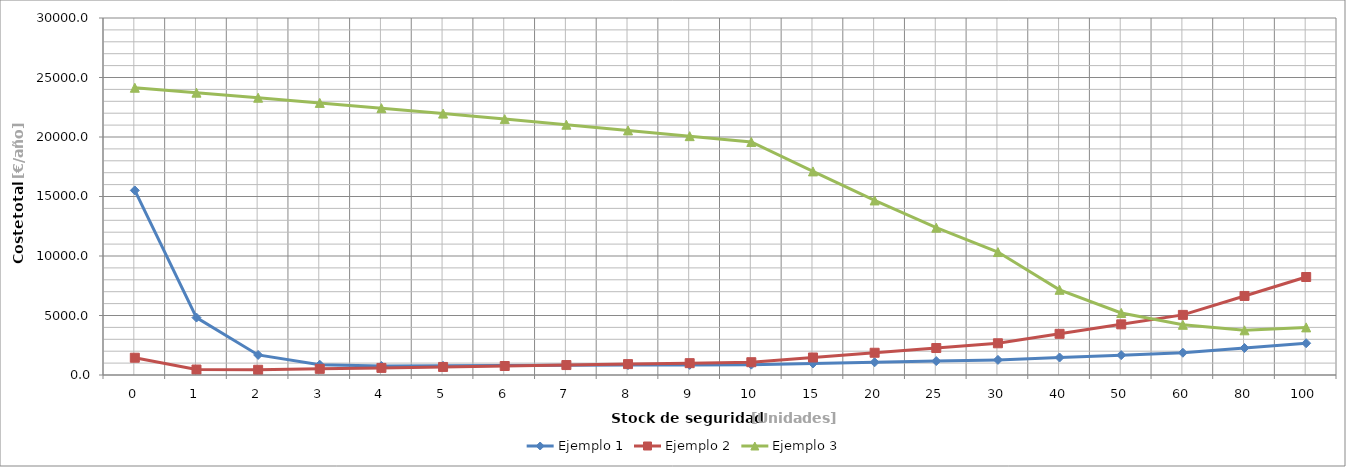
| Category | Ejemplo 1 | Ejemplo 2 | Ejemplo 3 | Item 4 | Item 5 | Item 6 | Item 7 | Item 8 | Item 9 | Item 10 | Item 11 | Item 12 | Item 13 | Item 14 | Item 15 | Item 16 | Item 17 | Item 18 | Item 19 | Item 20 | Item 21 | Item 22 | Item 23 | Item 24 | Item 25 | Item 26 | Item 27 | Item 28 | Item 29 | Item 30 |
|---|---|---|---|---|---|---|---|---|---|---|---|---|---|---|---|---|---|---|---|---|---|---|---|---|---|---|---|---|---|---|
| 0.0 | 15513.284 | 1451.674 | 24139.091 |  |  |  |  |  |  |  |  |  |  |  |  |  |  |  |  |  |  |  |  |  |  |  |  |  |  |  |
| 1.0 | 4825.09 | 458.37 | 23726.238 |  |  |  |  |  |  |  |  |  |  |  |  |  |  |  |  |  |  |  |  |  |  |  |  |  |  |  |
| 2.0 | 1685.895 | 439.42 | 23301.849 |  |  |  |  |  |  |  |  |  |  |  |  |  |  |  |  |  |  |  |  |  |  |  |  |  |  |  |
| 3.0 | 860.97 | 517.144 | 22866.601 |  |  |  |  |  |  |  |  |  |  |  |  |  |  |  |  |  |  |  |  |  |  |  |  |  |  |  |
| 4.0 | 759.46 | 596.7 | 22421.229 |  |  |  |  |  |  |  |  |  |  |  |  |  |  |  |  |  |  |  |  |  |  |  |  |  |  |  |
| 5.0 | 770.361 | 676.26 | 21966.523 |  |  |  |  |  |  |  |  |  |  |  |  |  |  |  |  |  |  |  |  |  |  |  |  |  |  |  |
| 6.0 | 790.007 | 755.82 | 21503.325 |  |  |  |  |  |  |  |  |  |  |  |  |  |  |  |  |  |  |  |  |  |  |  |  |  |  |  |
| 7.0 | 810 | 835.38 | 21032.518 |  |  |  |  |  |  |  |  |  |  |  |  |  |  |  |  |  |  |  |  |  |  |  |  |  |  |  |
| 8.0 | 830 | 914.94 | 20555.029 |  |  |  |  |  |  |  |  |  |  |  |  |  |  |  |  |  |  |  |  |  |  |  |  |  |  |  |
| 9.0 | 850 | 994.5 | 20071.814 |  |  |  |  |  |  |  |  |  |  |  |  |  |  |  |  |  |  |  |  |  |  |  |  |  |  |  |
| 10.0 | 870 | 1074.06 | 19583.862 |  |  |  |  |  |  |  |  |  |  |  |  |  |  |  |  |  |  |  |  |  |  |  |  |  |  |  |
| 15.0 | 970 | 1471.86 | 17108.705 |  |  |  |  |  |  |  |  |  |  |  |  |  |  |  |  |  |  |  |  |  |  |  |  |  |  |  |
| 20.0 | 1070 | 1869.66 | 14667.932 |  |  |  |  |  |  |  |  |  |  |  |  |  |  |  |  |  |  |  |  |  |  |  |  |  |  |  |
| 25.0 | 1170 | 2267.46 | 12378.531 |  |  |  |  |  |  |  |  |  |  |  |  |  |  |  |  |  |  |  |  |  |  |  |  |  |  |  |
| 30.0 | 1270 | 2665.26 | 10331.925 |  |  |  |  |  |  |  |  |  |  |  |  |  |  |  |  |  |  |  |  |  |  |  |  |  |  |  |
| 40.0 | 1470 | 3460.86 | 7159.428 |  |  |  |  |  |  |  |  |  |  |  |  |  |  |  |  |  |  |  |  |  |  |  |  |  |  |  |
| 50.0 | 1670 | 4256.46 | 5213.631 |  |  |  |  |  |  |  |  |  |  |  |  |  |  |  |  |  |  |  |  |  |  |  |  |  |  |  |
| 60.0 | 1870 | 5052.06 | 4219.212 |  |  |  |  |  |  |  |  |  |  |  |  |  |  |  |  |  |  |  |  |  |  |  |  |  |  |  |
| 80.0 | 2270 | 6643.26 | 3756.387 |  |  |  |  |  |  |  |  |  |  |  |  |  |  |  |  |  |  |  |  |  |  |  |  |  |  |  |
| 100.0 | 2670 | 8234.46 | 4001.93 |  |  |  |  |  |  |  |  |  |  |  |  |  |  |  |  |  |  |  |  |  |  |  |  |  |  |  |